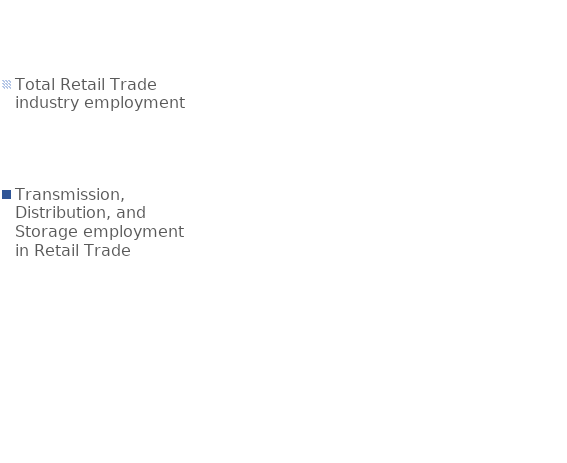
| Category | Total Retail Trade industry employment | #REF! | Transmission, Distribution, and Storage employment in Retail Trade |
|---|---|---|---|
| Retail Trade | 15584605 | 1 | 984143 |